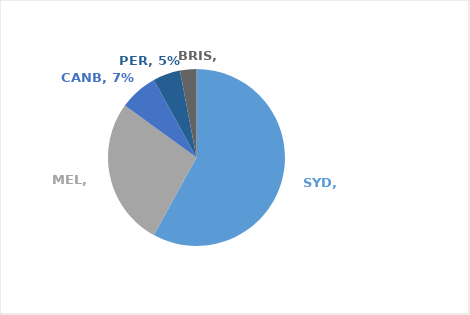
| Category | Series 0 |
|---|---|
| SYD | 0.58 |
| MEL | 0.27 |
| CANB | 0.07 |
| PER | 0.05 |
| BRIS | 0.03 |